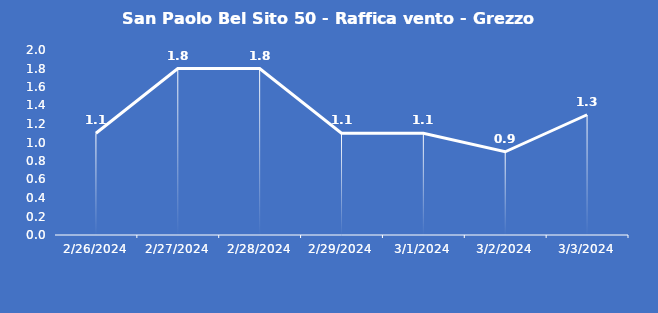
| Category | San Paolo Bel Sito 50 - Raffica vento - Grezzo (m/s) |
|---|---|
| 2/26/24 | 1.1 |
| 2/27/24 | 1.8 |
| 2/28/24 | 1.8 |
| 2/29/24 | 1.1 |
| 3/1/24 | 1.1 |
| 3/2/24 | 0.9 |
| 3/3/24 | 1.3 |